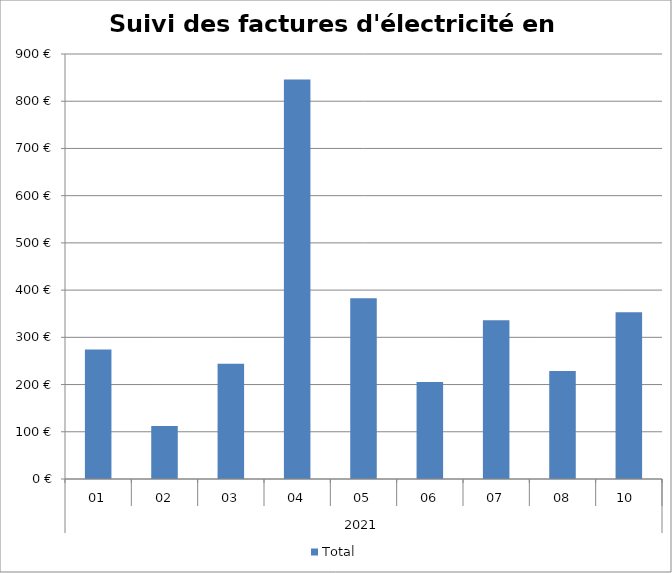
| Category | Total |
|---|---|
| 0 | 274.35 |
| 1 | 112.31 |
| 2 | 243.9 |
| 3 | 845.82 |
| 4 | 382.9 |
| 5 | 205.44 |
| 6 | 336.14 |
| 7 | 228.89 |
| 8 | 353.15 |